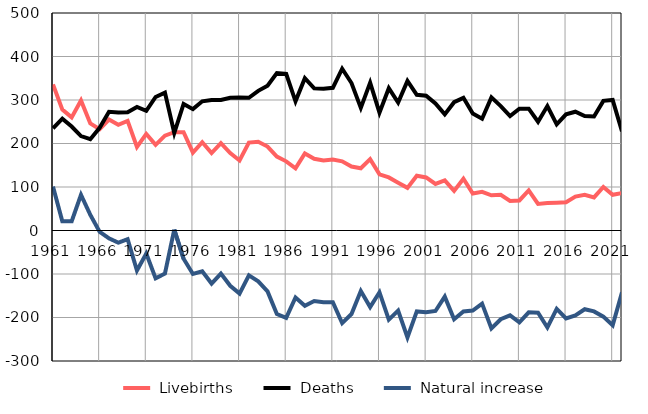
| Category |  Livebirths |  Deaths |  Natural increase |
|---|---|---|---|
| 1961.0 | 336 | 235 | 101 |
| 1962.0 | 278 | 257 | 21 |
| 1963.0 | 260 | 239 | 21 |
| 1964.0 | 299 | 217 | 82 |
| 1965.0 | 246 | 210 | 36 |
| 1966.0 | 233 | 236 | -3 |
| 1967.0 | 255 | 273 | -18 |
| 1968.0 | 243 | 271 | -28 |
| 1969.0 | 252 | 272 | -20 |
| 1970.0 | 192 | 284 | -92 |
| 1971.0 | 222 | 275 | -53 |
| 1972.0 | 197 | 307 | -110 |
| 1973.0 | 218 | 317 | -99 |
| 1974.0 | 226 | 224 | 2 |
| 1975.0 | 226 | 291 | -65 |
| 1976.0 | 179 | 279 | -100 |
| 1977.0 | 203 | 297 | -94 |
| 1978.0 | 178 | 300 | -122 |
| 1979.0 | 201 | 300 | -99 |
| 1980.0 | 178 | 305 | -127 |
| 1981.0 | 161 | 306 | -145 |
| 1982.0 | 202 | 305 | -103 |
| 1983.0 | 204 | 321 | -117 |
| 1984.0 | 193 | 333 | -140 |
| 1985.0 | 170 | 362 | -192 |
| 1986.0 | 159 | 360 | -201 |
| 1987.0 | 143 | 297 | -154 |
| 1988.0 | 177 | 350 | -173 |
| 1989.0 | 165 | 327 | -162 |
| 1990.0 | 161 | 326 | -165 |
| 1991.0 | 163 | 328 | -165 |
| 1992.0 | 159 | 372 | -213 |
| 1993.0 | 147 | 339 | -192 |
| 1994.0 | 143 | 282 | -139 |
| 1995.0 | 164 | 340 | -176 |
| 1996.0 | 129 | 271 | -142 |
| 1997.0 | 122 | 327 | -205 |
| 1998.0 | 110 | 294 | -184 |
| 1999.0 | 98 | 344 | -246 |
| 2000.0 | 126 | 312 | -186 |
| 2001.0 | 122 | 310 | -188 |
| 2002.0 | 107 | 292 | -185 |
| 2003.0 | 115 | 267 | -152 |
| 2004.0 | 91 | 295 | -204 |
| 2005.0 | 119 | 305 | -186 |
| 2006.0 | 85 | 269 | -184 |
| 2007.0 | 89 | 257 | -168 |
| 2008.0 | 81 | 306 | -225 |
| 2009.0 | 82 | 286 | -204 |
| 2010.0 | 68 | 263 | -195 |
| 2011.0 | 69 | 280 | -211 |
| 2012.0 | 92 | 280 | -188 |
| 2013.0 | 61 | 250 | -189 |
| 2014.0 | 63 | 286 | -223 |
| 2015.0 | 64 | 244 | -180 |
| 2016.0 | 65 | 267 | -202 |
| 2017.0 | 78 | 273 | -195 |
| 2018.0 | 82 | 263 | -181 |
| 2019.0 | 76 | 262 | -186 |
| 2020.0 | 100 | 298 | -198 |
| 2021.0 | 82 | 300 | -218 |
| 2022.0 | 86 | 228 | -142 |